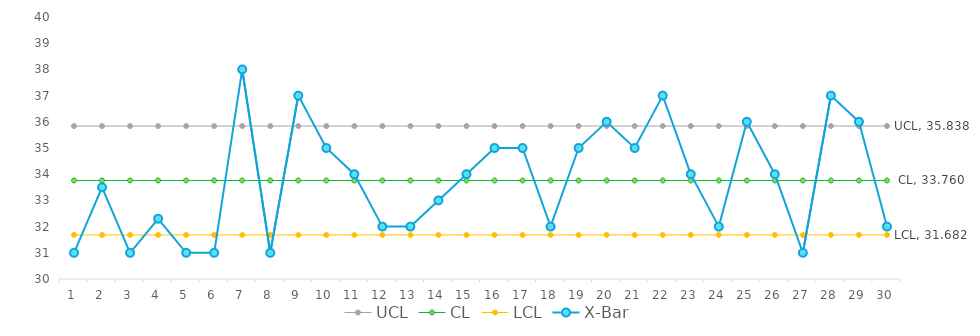
| Category | UCL | CL | LCL | X-Bar |
|---|---|---|---|---|
| 1.0 | 35.838 | 33.76 | 31.682 | 31 |
| 2.0 | 35.838 | 33.76 | 31.682 | 33.5 |
| 3.0 | 35.838 | 33.76 | 31.682 | 31 |
| 4.0 | 35.838 | 33.76 | 31.682 | 32.3 |
| 5.0 | 35.838 | 33.76 | 31.682 | 31 |
| 6.0 | 35.838 | 33.76 | 31.682 | 31 |
| 7.0 | 35.838 | 33.76 | 31.682 | 38 |
| 8.0 | 35.838 | 33.76 | 31.682 | 31 |
| 9.0 | 35.838 | 33.76 | 31.682 | 37 |
| 10.0 | 35.838 | 33.76 | 31.682 | 35 |
| 11.0 | 35.838 | 33.76 | 31.682 | 34 |
| 12.0 | 35.838 | 33.76 | 31.682 | 32 |
| 13.0 | 35.838 | 33.76 | 31.682 | 32 |
| 14.0 | 35.838 | 33.76 | 31.682 | 33 |
| 15.0 | 35.838 | 33.76 | 31.682 | 34 |
| 16.0 | 35.838 | 33.76 | 31.682 | 35 |
| 17.0 | 35.838 | 33.76 | 31.682 | 35 |
| 18.0 | 35.838 | 33.76 | 31.682 | 32 |
| 19.0 | 35.838 | 33.76 | 31.682 | 35 |
| 20.0 | 35.838 | 33.76 | 31.682 | 36 |
| 21.0 | 35.838 | 33.76 | 31.682 | 35 |
| 22.0 | 35.838 | 33.76 | 31.682 | 37 |
| 23.0 | 35.838 | 33.76 | 31.682 | 34 |
| 24.0 | 35.838 | 33.76 | 31.682 | 32 |
| 25.0 | 35.838 | 33.76 | 31.682 | 36 |
| 26.0 | 35.838 | 33.76 | 31.682 | 34 |
| 27.0 | 35.838 | 33.76 | 31.682 | 31 |
| 28.0 | 35.838 | 33.76 | 31.682 | 37 |
| 29.0 | 35.838 | 33.76 | 31.682 | 36 |
| 30.0 | 35.838 | 33.76 | 31.682 | 32 |